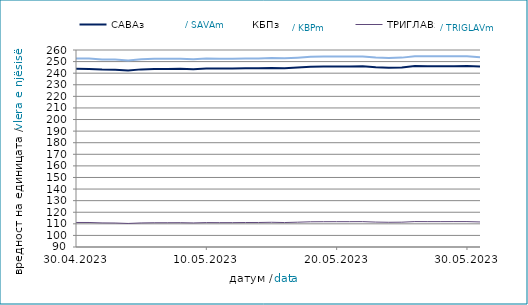
| Category | САВАз | КБПз | ТРИГЛАВз |
|---|---|---|---|
| 2023-04-30 | 243.817 | 252.648 | 111.168 |
| 2023-05-01 | 243.626 | 252.6 | 111.152 |
| 2023-05-02 | 243.094 | 251.836 | 110.798 |
| 2023-05-03 | 242.99 | 251.778 | 110.709 |
| 2023-05-04 | 242.413 | 251.03 | 110.332 |
| 2023-05-05 | 243.279 | 252.024 | 110.774 |
| 2023-05-06 | 243.59 | 252.381 | 110.937 |
| 2023-05-07 | 243.604 | 252.395 | 110.943 |
| 2023-05-08 | 243.78 | 252.465 | 110.983 |
| 2023-05-09 | 243.334 | 251.949 | 110.786 |
| 2023-05-10 | 244.034 | 252.625 | 111.071 |
| 2023-05-11 | 244.047 | 252.489 | 111.018 |
| 2023-05-12 | 243.989 | 252.48 | 111.028 |
| 2023-05-13 | 244.211 | 252.729 | 111.138 |
| 2023-05-14 | 244.225 | 252.743 | 111.145 |
| 2023-05-15 | 244.542 | 253.159 | 111.322 |
| 2023-05-16 | 244.29 | 252.784 | 111.112 |
| 2023-05-17 | 244.845 | 253.401 | 111.41 |
| 2023-05-18 | 245.618 | 254.159 | 111.752 |
| 2023-05-19 | 245.712 | 254.342 | 111.829 |
| 2023-05-20 | 245.754 | 254.389 | 111.85 |
| 2023-05-21 | 245.768 | 254.403 | 111.856 |
| 2023-05-22 | 246.007 | 254.492 | 111.886 |
| 2023-05-23 | 245.153 | 253.474 | 111.503 |
| 2023-05-24 | 244.749 | 252.99 | 111.323 |
| 2023-05-25 | 244.89 | 253.421 | 111.418 |
| 2023-05-26 | 246.099 | 254.662 | 111.927 |
| 2023-05-27 | 246.02 | 254.571 | 111.889 |
| 2023-05-28 | 246.035 | 254.585 | 111.896 |
| 2023-05-29 | 246.028 | 254.582 | 111.915 |
| 2023-05-30 | 246.217 | 254.529 | 111.92 |
| 2023-05-31 | 245.73 | 253.787 | 111.626 |